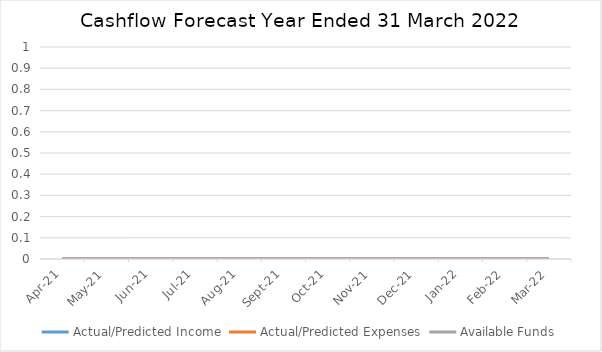
| Category | Actual/Predicted Income | Actual/Predicted Expenses | Available Funds |
|---|---|---|---|
| 2021-04-01 | 0 | 0 | 0 |
| 2021-05-01 | 0 | 0 | 0 |
| 2021-06-01 | 0 | 0 | 0 |
| 2021-07-01 | 0 | 0 | 0 |
| 2021-08-01 | 0 | 0 | 0 |
| 2021-09-01 | 0 | 0 | 0 |
| 2021-10-01 | 0 | 0 | 0 |
| 2021-11-01 | 0 | 0 | 0 |
| 2021-12-01 | 0 | 0 | 0 |
| 2022-01-01 | 0 | 0 | 0 |
| 2022-02-01 | 0 | 0 | 0 |
| 2022-03-01 | 0 | 0 | 0 |